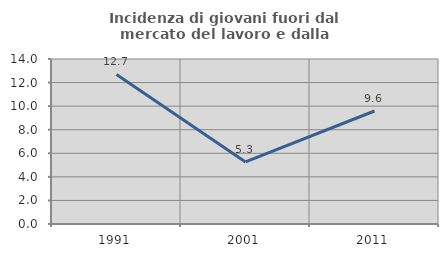
| Category | Incidenza di giovani fuori dal mercato del lavoro e dalla formazione  |
|---|---|
| 1991.0 | 12.69 |
| 2001.0 | 5.263 |
| 2011.0 | 9.589 |